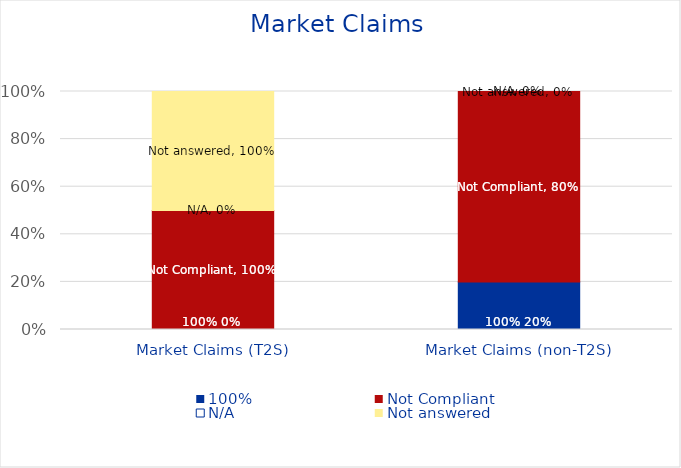
| Category | 100% | Not Compliant | N/A | Not answered |
|---|---|---|---|---|
| Market Claims (T2S) | 0 | 1 | 0 | 1 |
| Market Claims (non-T2S) | 0.2 | 0.8 | 0 | 0 |